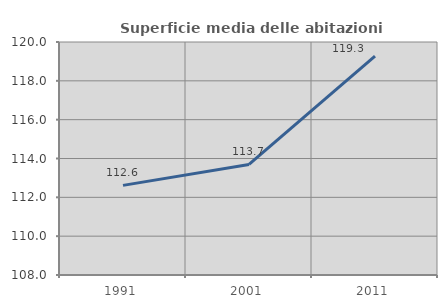
| Category | Superficie media delle abitazioni occupate |
|---|---|
| 1991.0 | 112.616 |
| 2001.0 | 113.694 |
| 2011.0 | 119.277 |